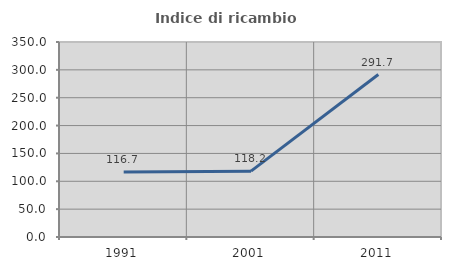
| Category | Indice di ricambio occupazionale  |
|---|---|
| 1991.0 | 116.667 |
| 2001.0 | 118.182 |
| 2011.0 | 291.667 |